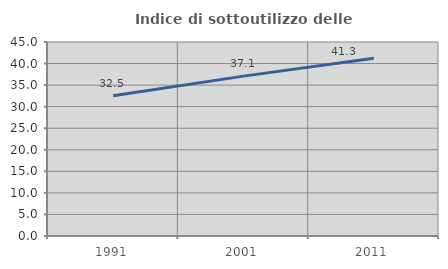
| Category | Indice di sottoutilizzo delle abitazioni  |
|---|---|
| 1991.0 | 32.532 |
| 2001.0 | 37.085 |
| 2011.0 | 41.251 |